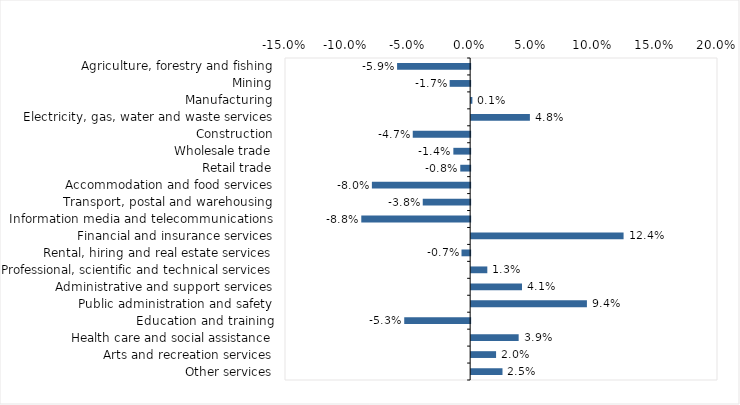
| Category | This week |
|---|---|
| Agriculture, forestry and fishing | -0.059 |
| Mining | -0.017 |
| Manufacturing | 0.001 |
| Electricity, gas, water and waste services | 0.048 |
| Construction | -0.046 |
| Wholesale trade | -0.014 |
| Retail trade | -0.008 |
| Accommodation and food services | -0.08 |
| Transport, postal and warehousing | -0.038 |
| Information media and telecommunications | -0.088 |
| Financial and insurance services | 0.124 |
| Rental, hiring and real estate services | -0.007 |
| Professional, scientific and technical services | 0.013 |
| Administrative and support services | 0.041 |
| Public administration and safety | 0.094 |
| Education and training | -0.053 |
| Health care and social assistance | 0.038 |
| Arts and recreation services | 0.02 |
| Other services | 0.025 |